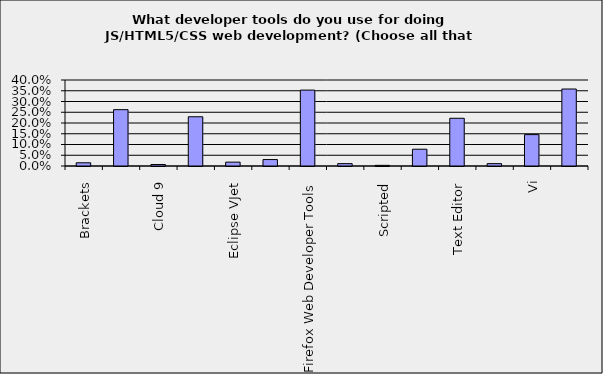
| Category | Series 0 |
|---|---|
| Brackets | 0.015 |
| Chrome DevTools | 0.262 |
| Cloud 9 | 0.007 |
| Eclipse JSDT | 0.229 |
| Eclipse VJet | 0.018 |
| Emacs | 0.03 |
| Firefox Web Developer Tools | 0.353 |
| Orion | 0.011 |
| Scripted | 0.003 |
| Sublime | 0.078 |
| Text Editor | 0.222 |
| Textmate | 0.011 |
| Vi | 0.146 |
| Don’t do JS/HTML5 development | 0.358 |